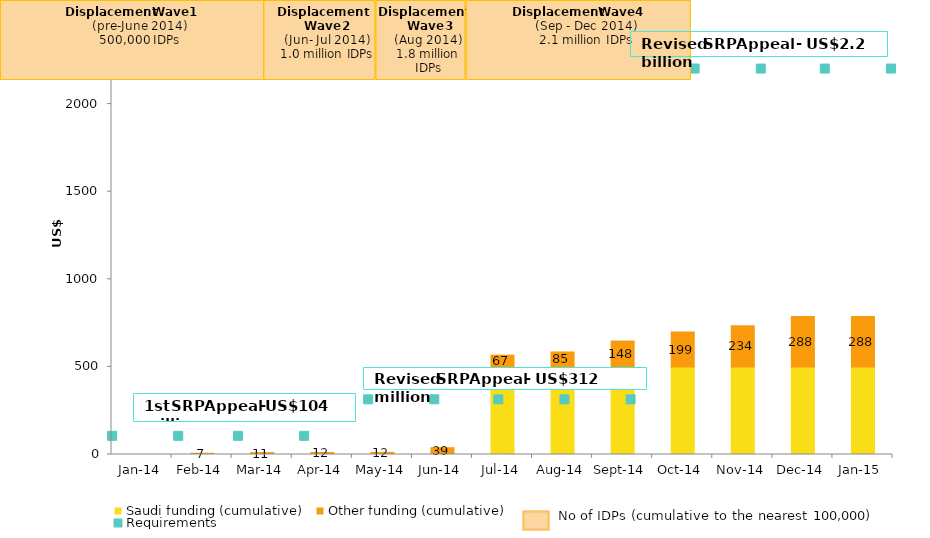
| Category | Saudi funding (cumulative) | Other funding (cumulative) |
|---|---|---|
| 2014-01-01 | 0 | 0.25 |
| 2014-02-01 | 0 | 7.043 |
| 2014-03-01 | 0 | 10.842 |
| 2014-04-01 | 0 | 11.556 |
| 2014-05-01 | 0 | 12.056 |
| 2014-06-01 | 0 | 38.817 |
| 2014-07-01 | 500 | 66.945 |
| 2014-08-01 | 500 | 85.11 |
| 2014-09-01 | 500 | 147.6 |
| 2014-10-01 | 500 | 198.522 |
| 2014-11-01 | 500 | 234.268 |
| 2014-12-01 | 500 | 287.999 |
| 2015-01-01 | 500 | 287.999 |